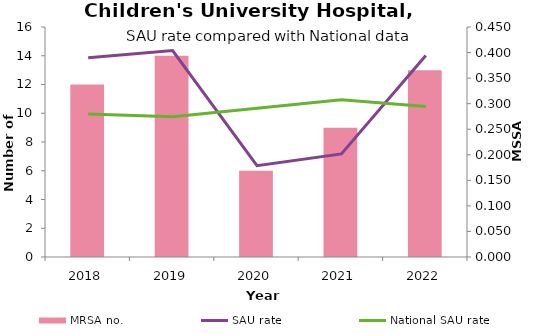
| Category | MRSA no. |
|---|---|
| 2018.0 | 12 |
| 2019.0 | 14 |
| 2020.0 | 6 |
| 2021.0 | 9 |
| 2022.0 | 13 |